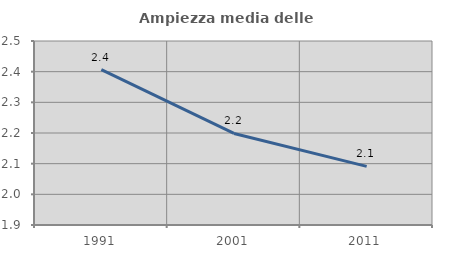
| Category | Ampiezza media delle famiglie |
|---|---|
| 1991.0 | 2.407 |
| 2001.0 | 2.198 |
| 2011.0 | 2.091 |